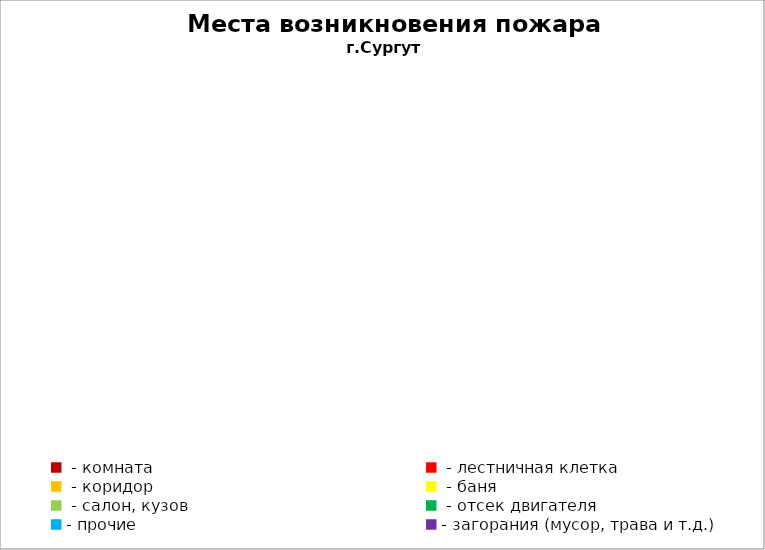
| Category | Места возникновения пожара |
|---|---|
|  - комната | 50 |
|  - лестничная клетка | 22 |
|  - коридор | 4 |
|  - баня | 31 |
|  - салон, кузов | 19 |
|  - отсек двигателя | 25 |
| - прочие | 79 |
| - загорания (мусор, трава и т.д.)  | 156 |